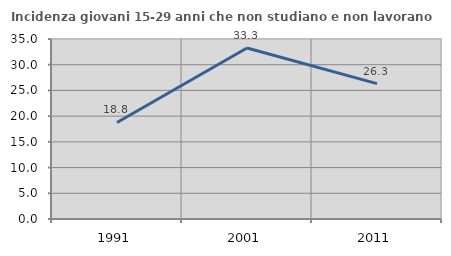
| Category | Incidenza giovani 15-29 anni che non studiano e non lavorano  |
|---|---|
| 1991.0 | 18.774 |
| 2001.0 | 33.259 |
| 2011.0 | 26.316 |